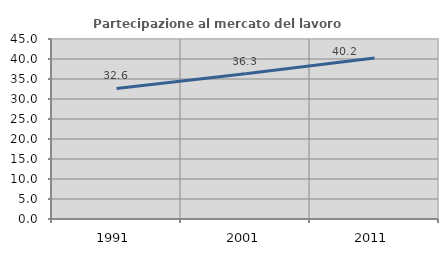
| Category | Partecipazione al mercato del lavoro  femminile |
|---|---|
| 1991.0 | 32.646 |
| 2001.0 | 36.32 |
| 2011.0 | 40.233 |